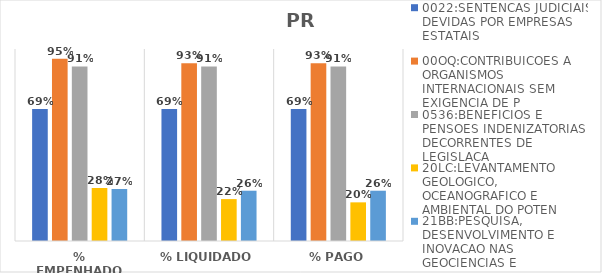
| Category | 0022:SENTENCAS JUDICIAIS DEVIDAS POR EMPRESAS ESTATAIS | 00OQ:CONTRIBUICOES A ORGANISMOS INTERNACIONAIS SEM EXIGENCIA DE P | 0536:BENEFICIOS E PENSOES INDENIZATORIAS DECORRENTES DE LEGISLACA | 20LC:LEVANTAMENTO GEOLOGICO, OCEANOGRAFICO E AMBIENTAL DO POTEN | 21BB:PESQUISA, DESENVOLVIMENTO E INOVACAO NAS GEOCIENCIAS E |
|---|---|---|---|---|---|
| % EMPENHADO | 0.688 | 0.95 | 0.909 | 0.276 | 0.271 |
| % LIQUIDADO | 0.688 | 0.926 | 0.909 | 0.218 | 0.262 |
| % PAGO | 0.688 | 0.926 | 0.909 | 0.201 | 0.262 |